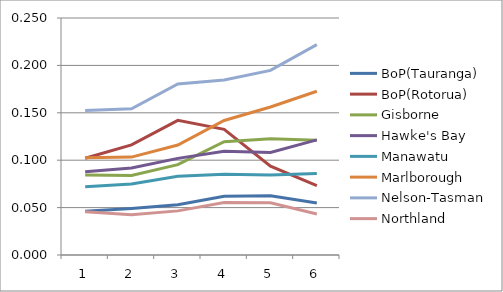
| Category | BoP(Tauranga) | BoP(Rotorua) | Gisborne | Hawke's Bay | Manawatu | Marlborough | Nelson-Tasman | Northland |
|---|---|---|---|---|---|---|---|---|
| 0 | 0.046 | 0.102 | 0.084 | 0.088 | 0.072 | 0.103 | 0.152 | 0.046 |
| 1 | 0.049 | 0.116 | 0.084 | 0.092 | 0.075 | 0.103 | 0.154 | 0.042 |
| 2 | 0.053 | 0.142 | 0.095 | 0.102 | 0.083 | 0.116 | 0.18 | 0.047 |
| 3 | 0.062 | 0.133 | 0.119 | 0.109 | 0.085 | 0.142 | 0.185 | 0.055 |
| 4 | 0.063 | 0.094 | 0.123 | 0.108 | 0.084 | 0.156 | 0.195 | 0.055 |
| 5 | 0.055 | 0.073 | 0.121 | 0.121 | 0.086 | 0.173 | 0.222 | 0.043 |